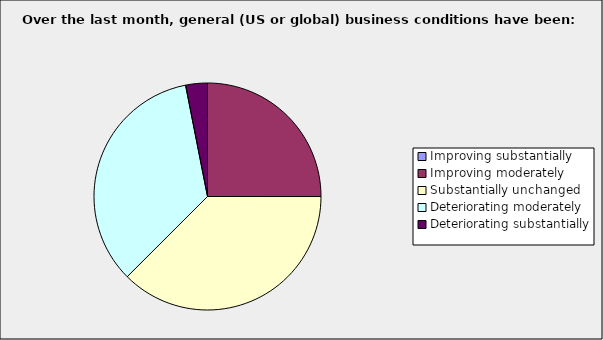
| Category | Series 0 |
|---|---|
| Improving substantially | 0 |
| Improving moderately | 0.25 |
| Substantially unchanged | 0.375 |
| Deteriorating moderately | 0.344 |
| Deteriorating substantially | 0.031 |